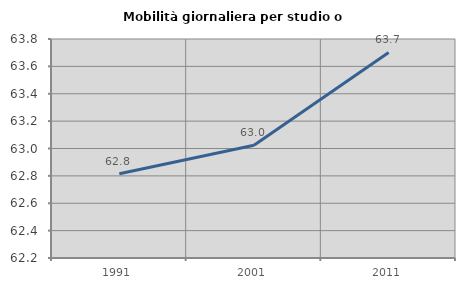
| Category | Mobilità giornaliera per studio o lavoro |
|---|---|
| 1991.0 | 62.815 |
| 2001.0 | 63.023 |
| 2011.0 | 63.701 |